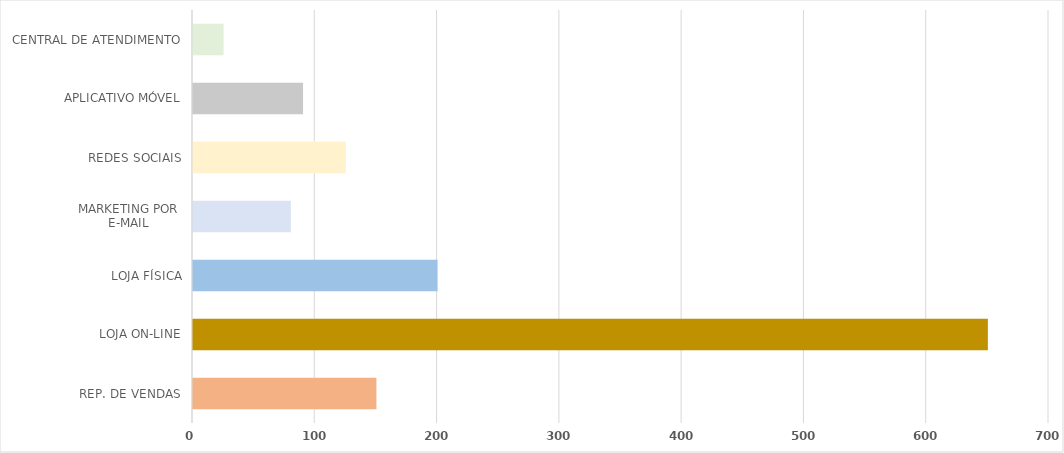
| Category | Series 0 |
|---|---|
| REP. DE VENDAS | 150 |
| LOJA ON-LINE | 650 |
| LOJA FÍSICA | 200 |
| MARKETING POR
E-MAIL | 80 |
| REDES SOCIAIS | 125 |
| APLICATIVO MÓVEL | 90 |
| CENTRAL DE ATENDIMENTO | 25 |